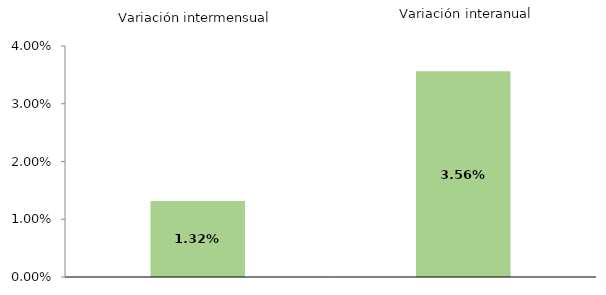
| Category | Series 0 |
|---|---|
| 0 | 1.316 |
| 1 | 3.564 |